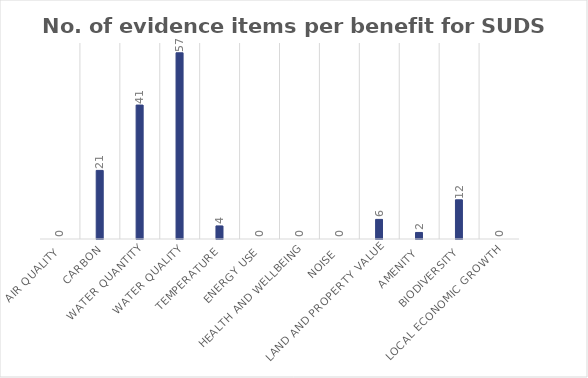
| Category | No. of evidence items |
|---|---|
| Air quality | 0 |
| Carbon | 21 |
| Water quantity | 41 |
| Water quality | 57 |
| Temperature | 4 |
| Energy use | 0 |
| Health and wellbeing | 0 |
| Noise | 0 |
| Land and property value | 6 |
| Amenity | 2 |
| Biodiversity | 12 |
| Local economic growth | 0 |